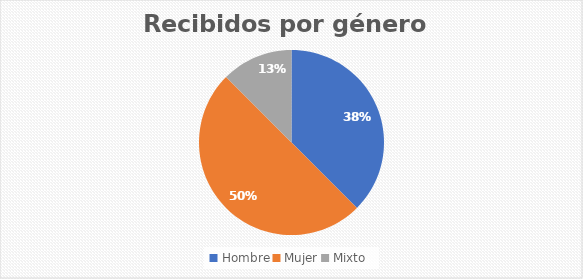
| Category | Recibidos por género  Cantidad |
|---|---|
| Hombre | 3 |
| Mujer | 4 |
| Mixto | 1 |